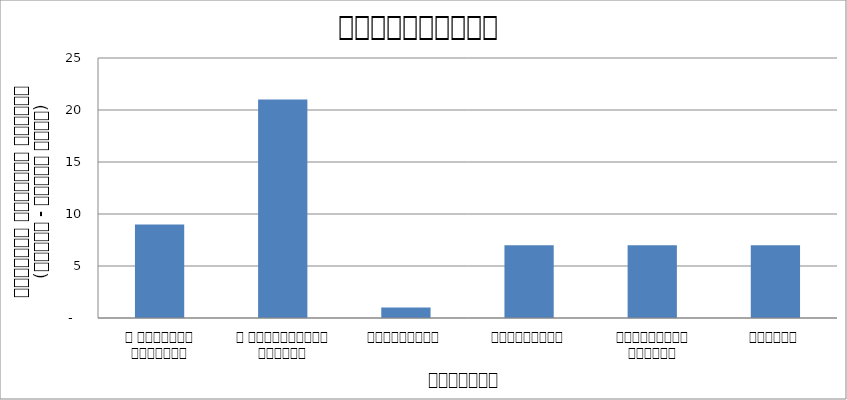
| Category | अर्थतन्त्र |
|---|---|
| द हिमालयन टाइम्स् | 9 |
| द काठमाण्डौं पोस्ट् | 21 |
| रिपब्लिका | 1 |
| कान्तिपुर | 7 |
| अन्नपूर्ण पोस्ट् | 7 |
| नागरिक | 7 |